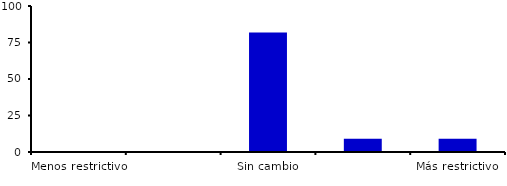
| Category | Series 0 |
|---|---|
| Menos restrictivo | 0 |
| Moderadamente menos restrictivo | 0 |
| Sin cambio | 81.818 |
| Moderadamente más restrictivo | 9.091 |
| Más restrictivo | 9.091 |